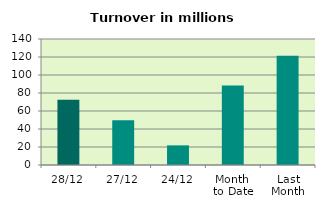
| Category | Series 0 |
|---|---|
| 28/12 | 72.585 |
| 27/12 | 49.71 |
| 24/12 | 21.815 |
| Month 
to Date | 88.346 |
| Last
Month | 121.455 |